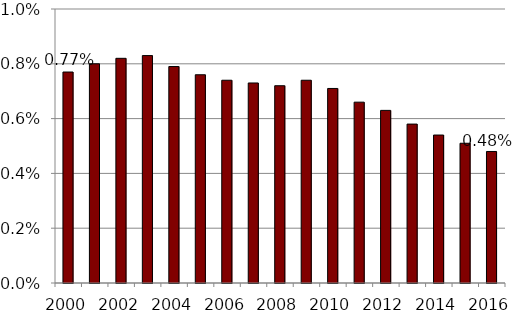
| Category | Series 0 |
|---|---|
| 2000.0 | 0.008 |
| 2001.0 | 0.008 |
| 2002.0 | 0.008 |
| 2003.0 | 0.008 |
| 2004.0 | 0.008 |
| 2005.0 | 0.008 |
| 2006.0 | 0.007 |
| 2007.0 | 0.007 |
| 2008.0 | 0.007 |
| 2009.0 | 0.007 |
| 2010.0 | 0.007 |
| 2011.0 | 0.007 |
| 2012.0 | 0.006 |
| 2013.0 | 0.006 |
| 2014.0 | 0.005 |
| 2015.0 | 0.005 |
| 2016.0 | 0.005 |